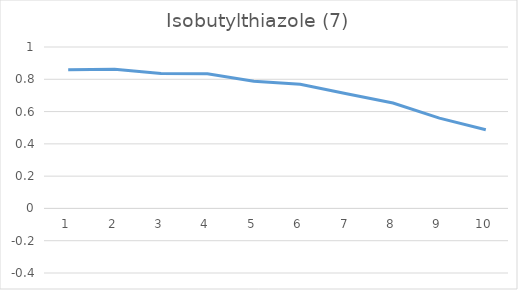
| Category | Series 0 |
|---|---|
| 0 | 0.86 |
| 1 | 0.862 |
| 2 | 0.836 |
| 3 | 0.834 |
| 4 | 0.788 |
| 5 | 0.769 |
| 6 | 0.71 |
| 7 | 0.653 |
| 8 | 0.559 |
| 9 | 0.488 |